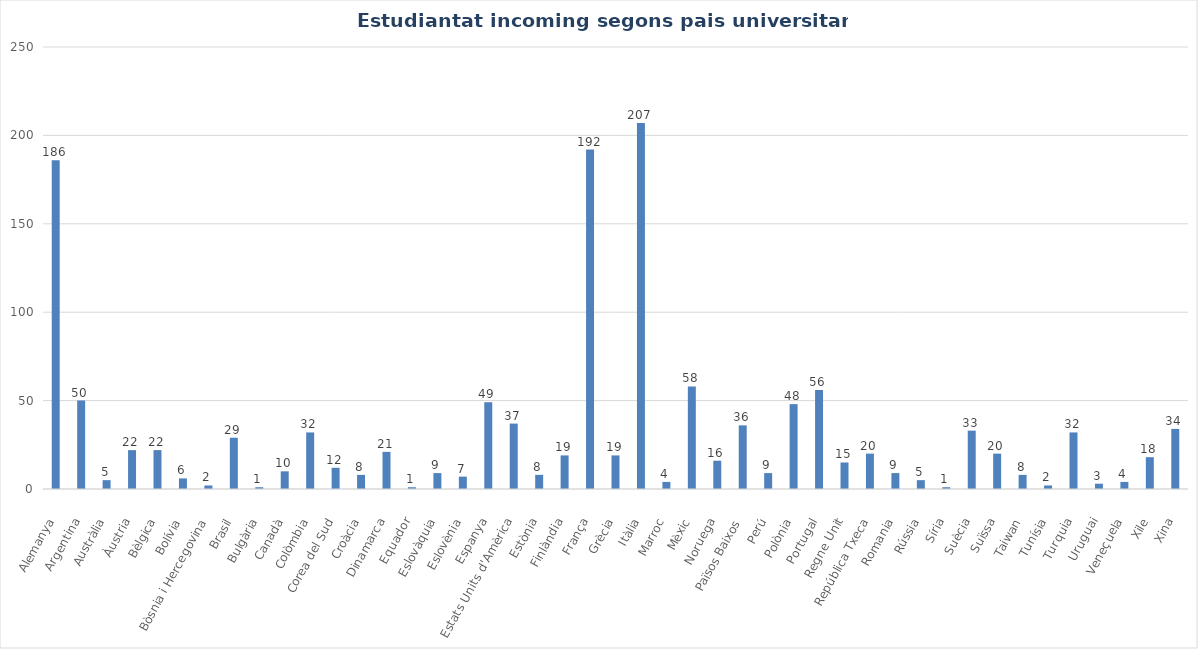
| Category | CuentaDeDNI |
|---|---|
| Alemanya | 186 |
| Argentina | 50 |
| Austràlia | 5 |
| Àustria | 22 |
| Bèlgica | 22 |
| Bolívia | 6 |
| Bòsnia i Hercegovina | 2 |
| Brasil | 29 |
| Bulgària | 1 |
| Canadà | 10 |
| Colòmbia | 32 |
| Corea del Sud | 12 |
| Croàcia | 8 |
| Dinamarca | 21 |
| Equador | 1 |
| Eslovàquia | 9 |
| Eslovènia | 7 |
| Espanya | 49 |
| Estats Units d'Amèrica | 37 |
| Estònia | 8 |
| Finlàndia | 19 |
| França | 192 |
| Grècia | 19 |
| Itàlia | 207 |
| Marroc | 4 |
| Mèxic | 58 |
| Noruega | 16 |
| Països Baixos | 36 |
| Perú | 9 |
| Polònia | 48 |
| Portugal | 56 |
| Regne Unit | 15 |
| República Txeca | 20 |
| Romania | 9 |
| Rússia | 5 |
| Síria | 1 |
| Suècia | 33 |
| Suïssa | 20 |
| Taiwan | 8 |
| Tunísia | 2 |
| Turquia | 32 |
| Uruguai | 3 |
| Veneçuela | 4 |
| Xile | 18 |
| Xina | 34 |